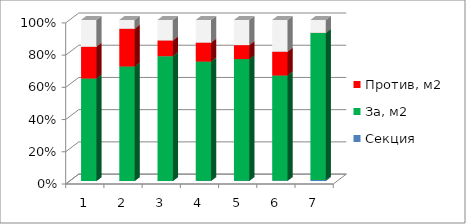
| Category | Секция | За, м2 | Против, м2 | Возд., м2 |
|---|---|---|---|---|
| 0 | 1 | 2239.572 | 693.49 | 586.95 |
| 1 | 2 | 2428.68 | 799.8 | 188 |
| 2 | 3 | 2885.781 | 363.937 | 474.95 |
| 3 | 4 | 2298.58 | 366 | 437.3 |
| 4 | 5 | 2723.275 | 312.6 | 563.125 |
| 5 | 6 | 1546.25 | 349.6 | 467.5 |
| 6 | 7 | 1020.3 | 0 | 90.1 |